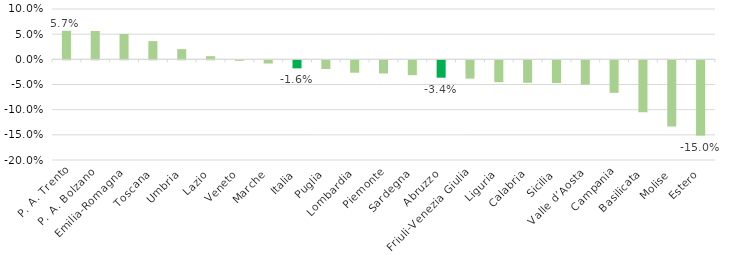
| Category | Series 0 |
|---|---|
| P. A. Trento | 0.057 |
| P. A. Bolzano | 0.056 |
| Emilia-Romagna | 0.05 |
| Toscana | 0.036 |
| Umbria | 0.02 |
| Lazio | 0.006 |
| Veneto | -0.001 |
| Marche | -0.006 |
| Italia | -0.016 |
| Puglia | -0.017 |
| Lombardia | -0.025 |
| Piemonte | -0.026 |
| Sardegna | -0.029 |
| Abruzzo | -0.034 |
| Friuli-Venezia Giulia | -0.036 |
| Liguria | -0.043 |
| Calabria | -0.045 |
| Sicilia | -0.045 |
| Valle d’Aosta | -0.048 |
| Campania | -0.065 |
| Basilicata | -0.103 |
| Molise | -0.131 |
| Estero | -0.15 |